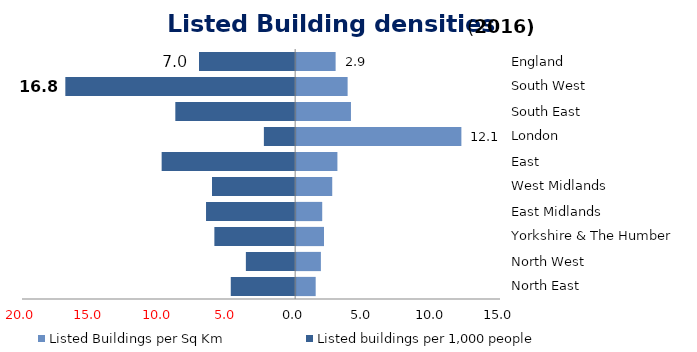
| Category | Listed Buildings per Sq Km | Listed buildings per 1,000 people |
|---|---|---|
| North East | 1.431 | -4.713 |
| North West | 1.812 | -3.608 |
| Yorkshire & The Humber | 2.041 | -5.914 |
| East Midlands | 1.91 | -6.525 |
| West Midlands | 2.643 | -6.088 |
| East | 3.022 | -9.775 |
| London | 12.099 | -2.289 |
| South East | 4.014 | -8.773 |
| South West | 3.769 | -16.827 |
| England | 2.891 | -7.04 |